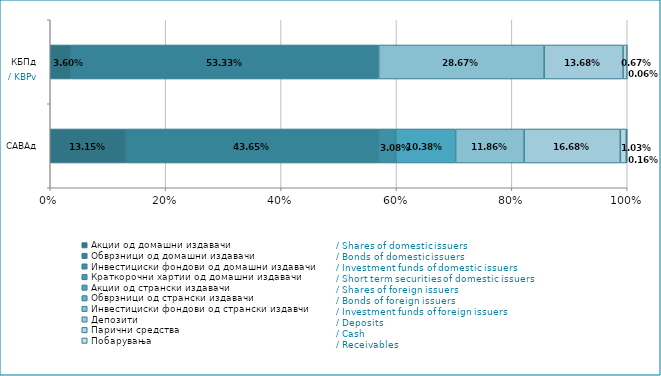
| Category | Акции од домашни издавачи  | Обврзници од домашни издавачи  | Инвестициски фондови од домашни издавачи   | Краткорочни хартии од домашни издавачи   | Акции од странски издавачи   | Обврзници од странски издавачи  | Инвестициски фондови од странски издавчи  | Депозити | Парични средства | Побарувања |
|---|---|---|---|---|---|---|---|---|---|---|
| САВАд | 0.131 | 0.436 | 0.031 | 0 | 0.104 | 0 | 0.119 | 0.167 | 0.01 | 0.002 |
| КБПд | 0.036 | 0.533 | 0 | 0 | 0 | 0 | 0.287 | 0.137 | 0.007 | 0.001 |